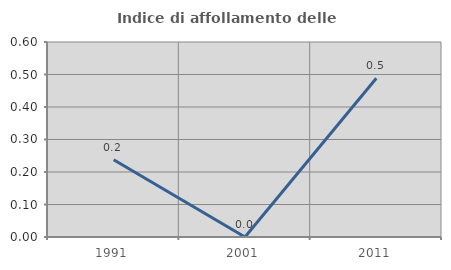
| Category | Indice di affollamento delle abitazioni  |
|---|---|
| 1991.0 | 0.238 |
| 2001.0 | 0 |
| 2011.0 | 0.488 |